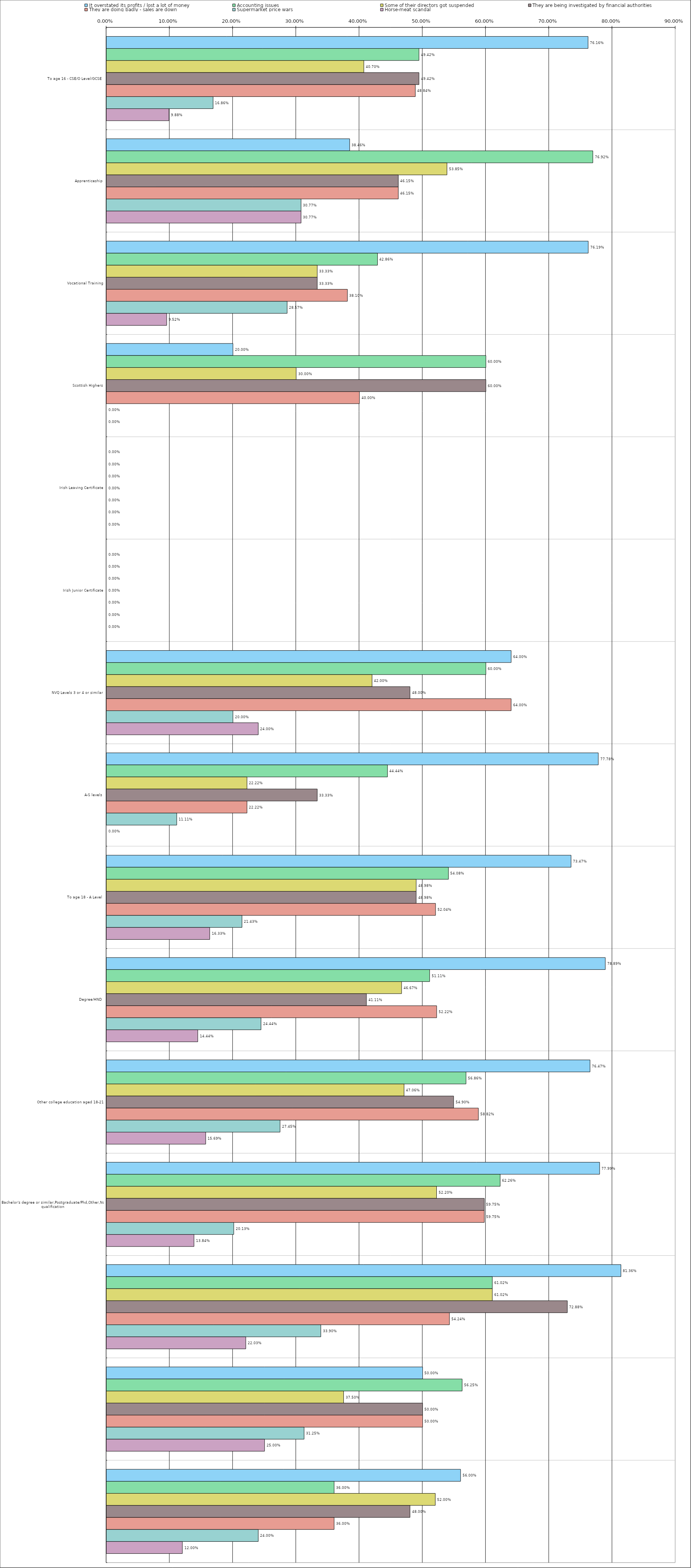
| Category | It overstated its profits / lost a lot of money | Accounting issues | Some of their directors got suspended | They are being investigated by financial authorities | They are doing badly - sales are down | Supermarket price wars | Horse-meat scandal |
|---|---|---|---|---|---|---|---|
| 0 | 0.762 | 0.494 | 0.407 | 0.494 | 0.488 | 0.169 | 0.099 |
| 1 | 0.385 | 0.769 | 0.538 | 0.462 | 0.462 | 0.308 | 0.308 |
| 2 | 0.762 | 0.429 | 0.333 | 0.333 | 0.381 | 0.286 | 0.095 |
| 3 | 0.2 | 0.6 | 0.3 | 0.6 | 0.4 | 0 | 0 |
| 4 | 0 | 0 | 0 | 0 | 0 | 0 | 0 |
| 5 | 0 | 0 | 0 | 0 | 0 | 0 | 0 |
| 6 | 0.64 | 0.6 | 0.42 | 0.48 | 0.64 | 0.2 | 0.24 |
| 7 | 0.778 | 0.444 | 0.222 | 0.333 | 0.222 | 0.111 | 0 |
| 8 | 0.735 | 0.541 | 0.49 | 0.49 | 0.52 | 0.214 | 0.163 |
| 9 | 0.789 | 0.511 | 0.467 | 0.411 | 0.522 | 0.244 | 0.144 |
| 10 | 0.765 | 0.569 | 0.471 | 0.549 | 0.588 | 0.274 | 0.157 |
| 11 | 0.78 | 0.623 | 0.522 | 0.598 | 0.598 | 0.201 | 0.138 |
| 12 | 0.814 | 0.61 | 0.61 | 0.729 | 0.542 | 0.339 | 0.22 |
| 13 | 0.5 | 0.562 | 0.375 | 0.5 | 0.5 | 0.312 | 0.25 |
| 14 | 0.56 | 0.36 | 0.52 | 0.48 | 0.36 | 0.24 | 0.12 |